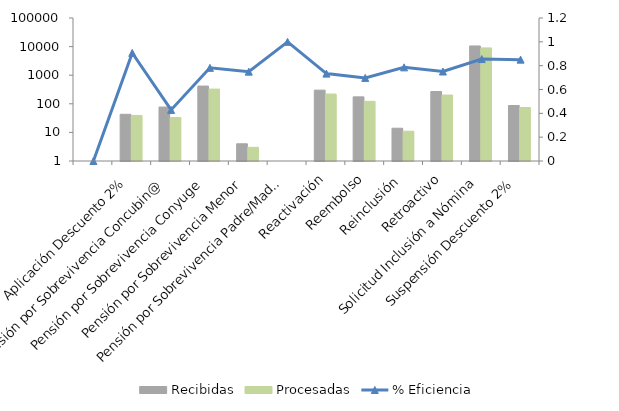
| Category | Recibidas | Procesadas |
|---|---|---|
|  | 0 | 0 |
| Aplicación Descuento 2% | 43 | 39 |
| Pensión por Sobrevivencia Concubin@ | 77 | 33 |
| Pensión por Sobrevivencia Conyuge | 417 | 326 |
| Pensión por Sobrevivencia Menor | 4 | 3 |
| Pensión por Sobrevivencia Padre/Madre | 1 | 1 |
| Reactivación | 300 | 220 |
| Reembolso | 175 | 122 |
| Reinclusión | 14 | 11 |
| Retroactivo | 269 | 202 |
| Solicitud Inclusión a Nómina | 10528 | 9005 |
| Suspensión Descuento 2% | 87 | 74 |